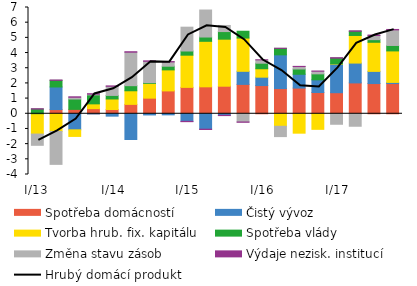
| Category | Spotřeba domácností  | Čistý vývoz  | Tvorba hrub. fix. kapitálu | Spotřeba vlády | Změna stavu zásob  | Výdaje nezisk. institucí |
|---|---|---|---|---|---|---|
| I/13 | 0.003 | -0.022 | -1.315 | 0.303 | -0.74 | 0.026 |
| II | 0.277 | 1.487 | -1.164 | 0.435 | -2.169 | 0.025 |
| III | 0.289 | -1.058 | -0.434 | 0.682 | 0.116 | 0.029 |
|  IV | 0.337 | -0.011 | 0.317 | 0.589 | 0.05 | 0.028 |
|  I/14 | 0.281 | -0.156 | 0.693 | 0.234 | 0.6 | 0.025 |
| II | 0.619 | -1.693 | 0.897 | 0.335 | 2.204 | 0.031 |
| III | 1.029 | -0.077 | 0.971 | 0.049 | 1.407 | 0.029 |
| IV | 1.506 | -0.071 | 1.386 | 0.242 | 0.279 | 0.028 |
|  I/15 | 1.738 | -0.497 | 2.121 | 0.275 | 1.57 | -0.022 |
| II | 1.775 | -1.015 | 2.998 | 0.283 | 1.779 | -0.021 |
| III | 1.816 | -0.099 | 3.097 | 0.501 | 0.402 | -0.021 |
| IV | 1.935 | 0.862 | 2.19 | 0.45 | -0.54 | -0.019 |
|  I/16 | 1.858 | 0.553 | 0.554 | 0.366 | 0.218 | 0.005 |
| II | 1.66 | 2.221 | -0.824 | 0.426 | -0.679 | 0.01 |
| III | 1.693 | 0.909 | -1.278 | 0.349 | 0.159 | 0.012 |
| IV | 1.402 | 0.834 | -1.026 | 0.393 | 0.173 | 0.011 |
|  I/17 | 1.388 | 1.881 | 0.023 | 0.37 | -0.691 | 0.032 |
| II | 2.033 | 1.306 | 1.819 | 0.276 | -0.822 | 0.031 |
| III | 1.991 | 0.801 | 1.917 | 0.172 | 0.275 | 0.029 |
| IV | 1.991 | 0.075 | 2.075 | 0.358 | 1.027 | 0.028 |